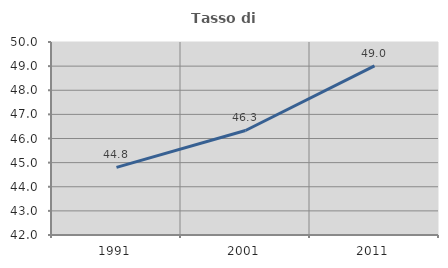
| Category | Tasso di occupazione   |
|---|---|
| 1991.0 | 44.803 |
| 2001.0 | 46.332 |
| 2011.0 | 49.007 |